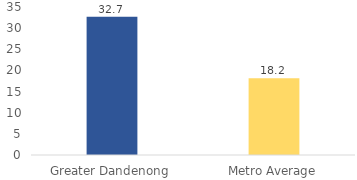
| Category | Series 0 |
|---|---|
| Greater Dandenong | 32.7 |
| Metro Average | 18.171 |